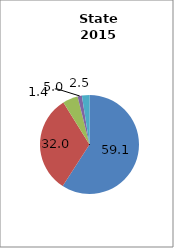
| Category | Arkansas |
|---|---|
| White | 59.108 |
| Black | 32.04 |
| Hispanic | 4.979 |
| Two or More Races | 1.408 |
| All Other1 | 2.466 |